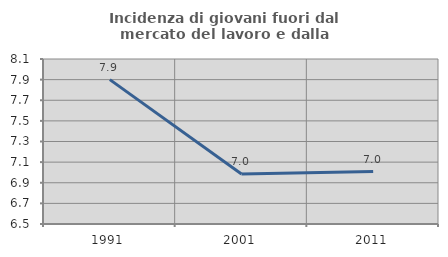
| Category | Incidenza di giovani fuori dal mercato del lavoro e dalla formazione  |
|---|---|
| 1991.0 | 7.9 |
| 2001.0 | 6.985 |
| 2011.0 | 7.008 |